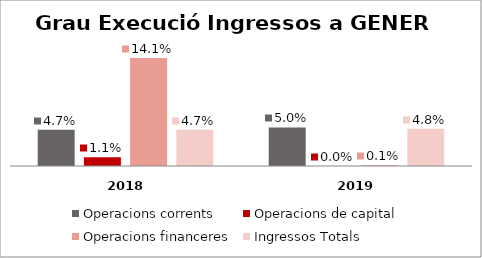
| Category | Operacions corrents | Operacions de capital | Operacions financeres | Ingressos Totals |
|---|---|---|---|---|
| 0 | 0.047 | 0.011 | 0.141 | 0.047 |
| 1 | 0.05 | 0 | 0.001 | 0.048 |